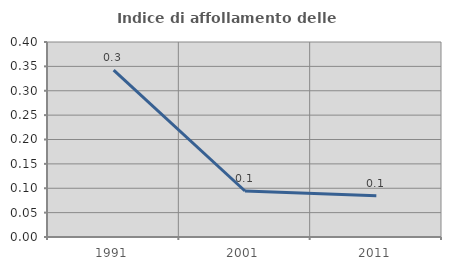
| Category | Indice di affollamento delle abitazioni  |
|---|---|
| 1991.0 | 0.342 |
| 2001.0 | 0.094 |
| 2011.0 | 0.085 |